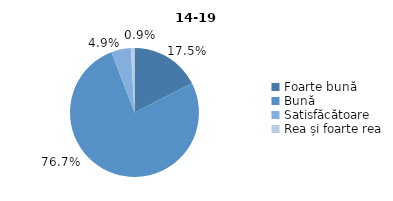
| Category | Series 0 |
|---|---|
| Foarte bună | 17.5 |
| Bună | 76.7 |
| Satisfăcătoare | 4.9 |
| Rea și foarte rea | 0.9 |